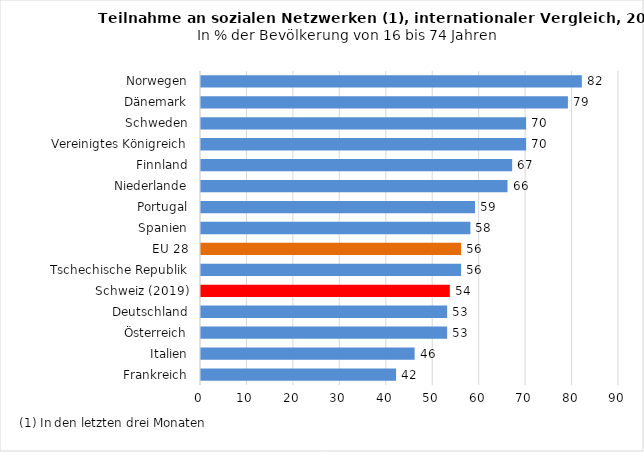
| Category | Series 0 |
|---|---|
| Frankreich | 42 |
| Italien | 46 |
| Österreich | 53 |
| Deutschland | 53 |
| Schweiz (2019) | 53.573 |
| Tschechische Republik | 56 |
| EU 28 | 56 |
| Spanien | 58 |
| Portugal | 59 |
| Niederlande | 66 |
| Finnland | 67 |
| Vereinigtes Königreich | 70 |
| Schweden | 70 |
| Dänemark | 79 |
| Norwegen | 82 |